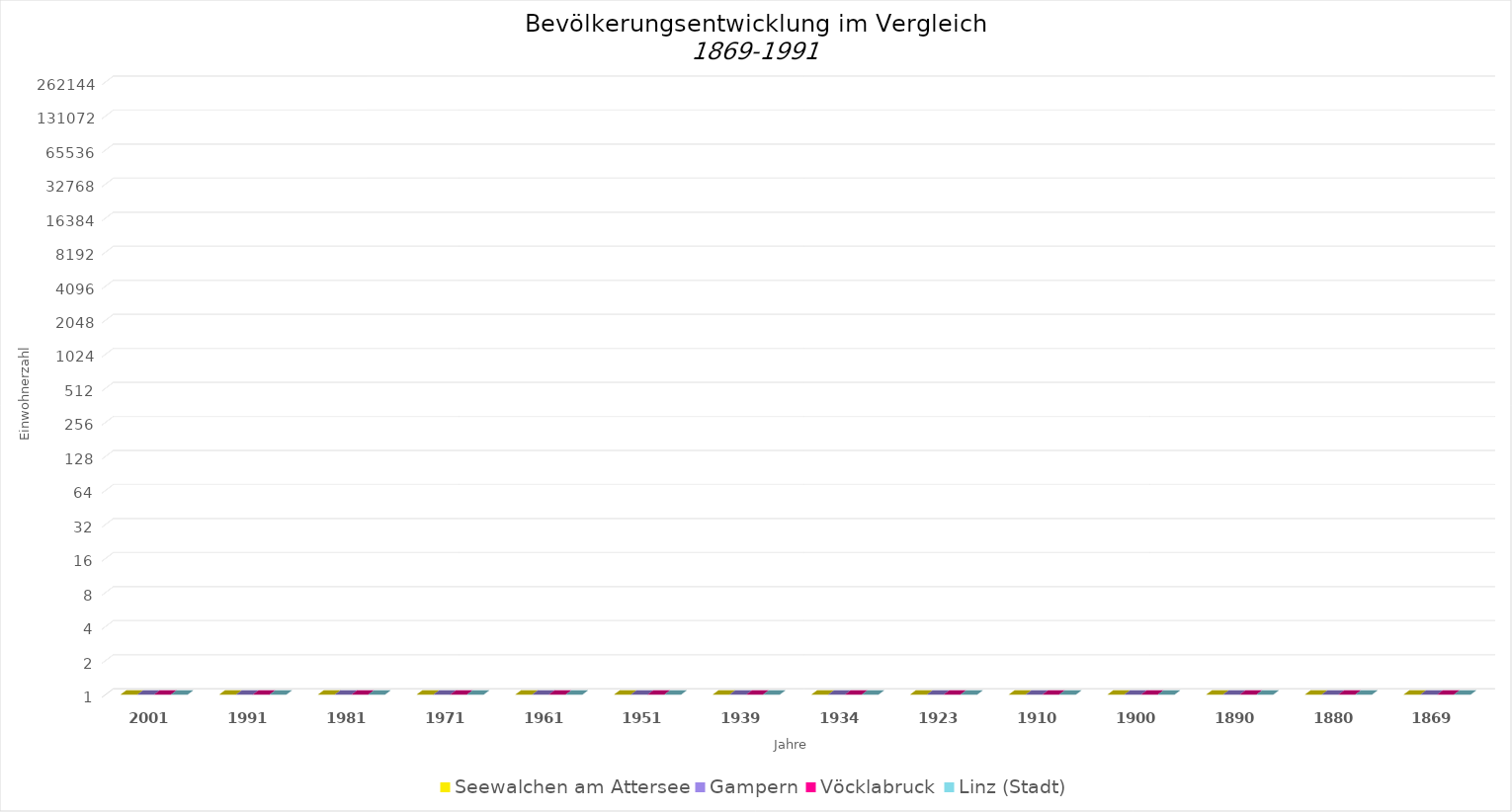
| Category | Seewalchen am Attersee | Gampern | Vöcklabruck | Linz (Stadt) |
|---|---|---|---|---|
| 2001.0 | 4761 | 2464 | 11694 | 183614 |
| 1991.0 | 4253 | 2212 | 11239 | 203044 |
| 1981.0 | 3951 | 2010 | 11019 | 199910 |
| 1971.0 | 3835 | 1862 | 10732 | 204889 |
| 1961.0 | 3347 | 1683 | 9353 | 195978 |
| 1951.0 | 3105 | 1794 | 8857 | 184685 |
| 1939.0 | 2491 | 1483 | 5546 | 128177 |
| 1934.0 | 1916 | 1558 | 5017 | 115338 |
| 1923.0 | 1718 | 1629 | 4520 | 107463 |
| 1910.0 | 1663 | 1694 | 4338 | 97852 |
| 1900.0 | 1535 | 1540 | 3562 | 83356 |
| 1890.0 | 1555 | 1593 | 3294 | 65090 |
| 1880.0 | 1556 | 1593 | 3076 | 56569 |
| 1869.0 | 1532 | 1695 | 2794 | 49635 |